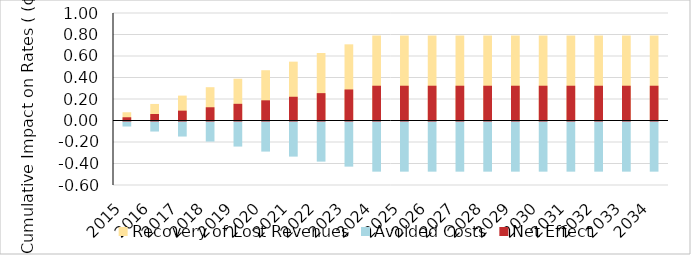
| Category | Recovery of Lost Revenues | Avoided Costs |
|---|---|---|
| 2015.0 | 0.077 | -0.047 |
| 2016.0 | 0.154 | -0.093 |
| 2017.0 | 0.232 | -0.14 |
| 2018.0 | 0.31 | -0.187 |
| 2019.0 | 0.388 | -0.233 |
| 2020.0 | 0.468 | -0.28 |
| 2021.0 | 0.547 | -0.327 |
| 2022.0 | 0.628 | -0.373 |
| 2023.0 | 0.709 | -0.42 |
| 2024.0 | 0.79 | -0.467 |
| 2025.0 | 0.79 | -0.467 |
| 2026.0 | 0.79 | -0.467 |
| 2027.0 | 0.79 | -0.467 |
| 2028.0 | 0.79 | -0.467 |
| 2029.0 | 0.79 | -0.467 |
| 2030.0 | 0.79 | -0.467 |
| 2031.0 | 0.79 | -0.467 |
| 2032.0 | 0.79 | -0.467 |
| 2033.0 | 0.79 | -0.467 |
| 2034.0 | 0.79 | -0.467 |